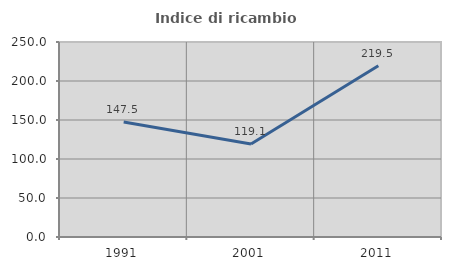
| Category | Indice di ricambio occupazionale  |
|---|---|
| 1991.0 | 147.5 |
| 2001.0 | 119.149 |
| 2011.0 | 219.512 |